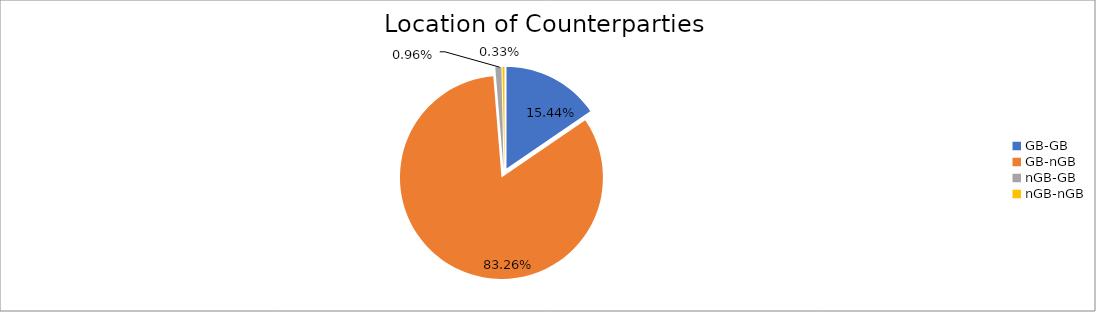
| Category | Series 0 |
|---|---|
| GB-GB | 1426803.69 |
| GB-nGB | 7692884.151 |
| nGB-GB | 89044.741 |
| nGB-nGB | 30373.067 |